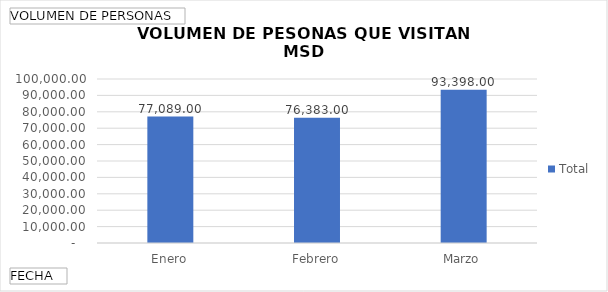
| Category | Total |
|---|---|
| Enero | 77089 |
| Febrero | 76383 |
| Marzo | 93398 |